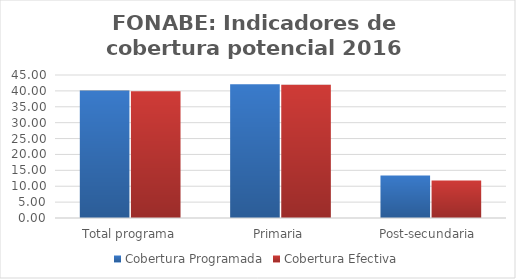
| Category | Cobertura Programada | Cobertura Efectiva |
|---|---|---|
| Total programa | 40.103 | 39.891 |
| Primaria | 42.059 | 41.948 |
| Post-secundaria  | 13.391 | 11.807 |